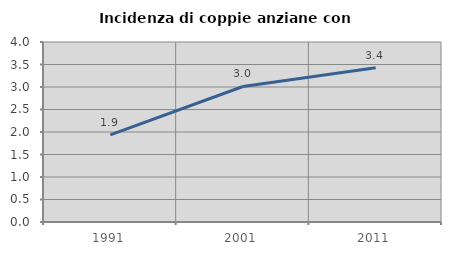
| Category | Incidenza di coppie anziane con figli |
|---|---|
| 1991.0 | 1.935 |
| 2001.0 | 3.012 |
| 2011.0 | 3.428 |